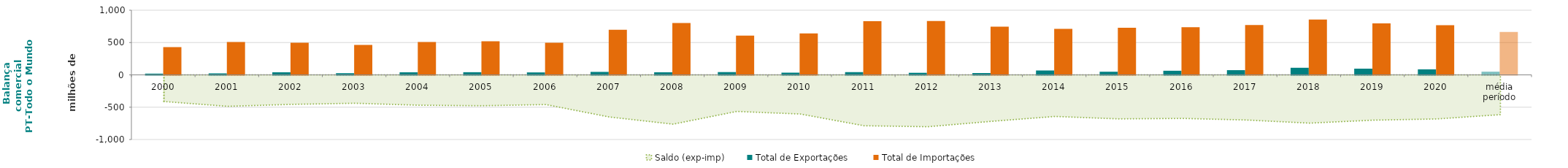
| Category | Total de Exportações  | Total de Importações  |
|---|---|---|
| 2000 | 18.76 | 430.782 |
| 2001 | 22.642 | 508.857 |
| 2002 | 40.29 | 496.847 |
| 2003 | 25.413 | 464.422 |
| 2004 | 40.041 | 509.224 |
| 2005 | 41.18 | 518.558 |
| 2006 | 38.041 | 497.247 |
| 2007 | 46.069 | 697.748 |
| 2008 | 40.182 | 802.757 |
| 2009 | 43.124 | 608.738 |
| 2010 | 34.269 | 640.042 |
| 2011 | 42.44 | 829.525 |
| 2012 | 32.005 | 834.33 |
| 2013 | 27.705 | 746.74 |
| 2014 | 67.868 | 710.988 |
| 2015 | 48.616 | 729.366 |
| 2016 | 63.8 | 737.446 |
| 2017 | 72.833 | 770.613 |
| 2018 | 109.722 | 856.184 |
| 2019 | 95.873 | 796.616 |
| 2020 | 85.267 | 767.083 |
| média período | 49.34 | 664.482 |